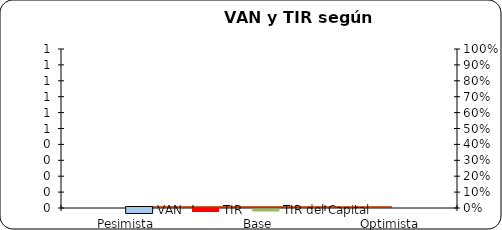
| Category | VAN |
|---|---|
| Pesimista | 0 |
| Base | 0 |
| Optimista | 0 |